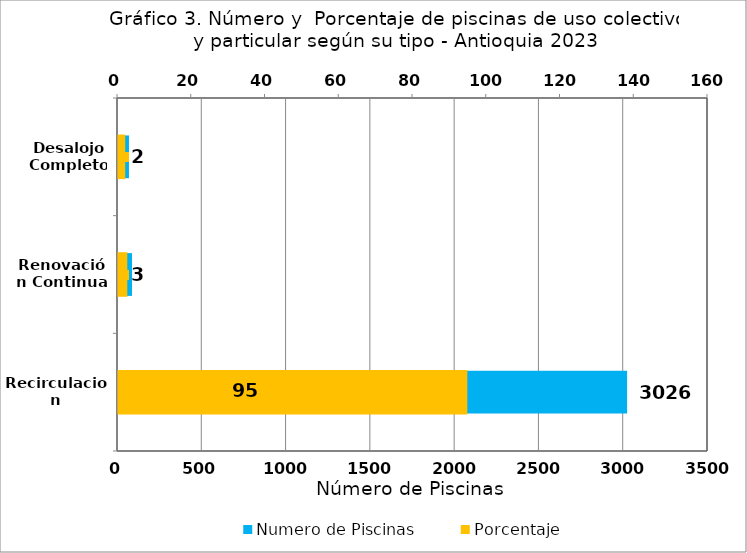
| Category | Numero de Piscinas |
|---|---|
| Recirculacion | 3026 |
| Renovación Continua | 89 |
| Desalojo Completo | 71 |